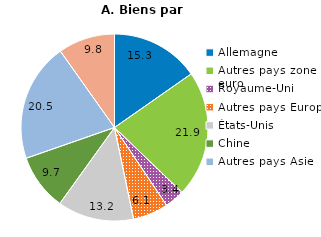
| Category | Exportation de biens par destination |
|---|---|
| Allemagne |  |
| Autres pays zone euro |  |
| Royaume-Uni |  |
| Autres pays Europe |  |
| États-Unis |  |
| Chine |  |
| Autres pays Asie |  |
| Autres |  |